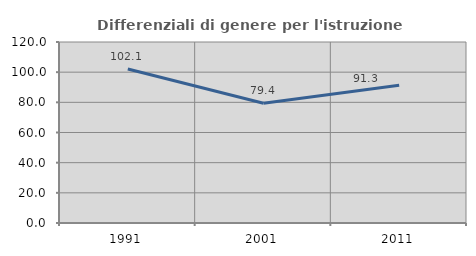
| Category | Differenziali di genere per l'istruzione superiore |
|---|---|
| 1991.0 | 102.057 |
| 2001.0 | 79.433 |
| 2011.0 | 91.256 |